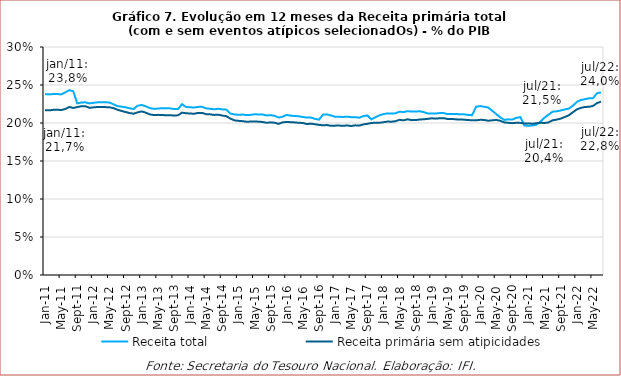
| Category | Receita total | Receita primária sem atipicidades |
|---|---|---|
| 2011-01-01 | 0.238 | 0.217 |
| 2011-02-01 | 0.238 | 0.217 |
| 2011-03-01 | 0.238 | 0.217 |
| 2011-04-01 | 0.238 | 0.218 |
| 2011-05-01 | 0.238 | 0.217 |
| 2011-06-01 | 0.24 | 0.218 |
| 2011-07-01 | 0.243 | 0.221 |
| 2011-08-01 | 0.242 | 0.22 |
| 2011-09-01 | 0.226 | 0.221 |
| 2011-10-01 | 0.227 | 0.222 |
| 2011-11-01 | 0.227 | 0.222 |
| 2011-12-01 | 0.226 | 0.22 |
| 2012-01-01 | 0.227 | 0.221 |
| 2012-02-01 | 0.227 | 0.221 |
| 2012-03-01 | 0.227 | 0.221 |
| 2012-04-01 | 0.227 | 0.221 |
| 2012-05-01 | 0.227 | 0.221 |
| 2012-06-01 | 0.225 | 0.22 |
| 2012-07-01 | 0.222 | 0.217 |
| 2012-08-01 | 0.222 | 0.216 |
| 2012-09-01 | 0.221 | 0.214 |
| 2012-10-01 | 0.219 | 0.213 |
| 2012-11-01 | 0.218 | 0.212 |
| 2012-12-01 | 0.223 | 0.214 |
| 2013-01-01 | 0.224 | 0.215 |
| 2013-02-01 | 0.222 | 0.214 |
| 2013-03-01 | 0.22 | 0.211 |
| 2013-04-01 | 0.219 | 0.21 |
| 2013-05-01 | 0.219 | 0.211 |
| 2013-06-01 | 0.219 | 0.211 |
| 2013-07-01 | 0.219 | 0.21 |
| 2013-08-01 | 0.219 | 0.21 |
| 2013-09-01 | 0.218 | 0.21 |
| 2013-10-01 | 0.218 | 0.21 |
| 2013-11-01 | 0.225 | 0.214 |
| 2013-12-01 | 0.221 | 0.213 |
| 2014-01-01 | 0.221 | 0.212 |
| 2014-02-01 | 0.22 | 0.212 |
| 2014-03-01 | 0.221 | 0.213 |
| 2014-04-01 | 0.221 | 0.213 |
| 2014-05-01 | 0.219 | 0.212 |
| 2014-06-01 | 0.219 | 0.211 |
| 2014-07-01 | 0.218 | 0.211 |
| 2014-08-01 | 0.219 | 0.211 |
| 2014-09-01 | 0.218 | 0.21 |
| 2014-10-01 | 0.218 | 0.209 |
| 2014-11-01 | 0.212 | 0.206 |
| 2014-12-01 | 0.211 | 0.204 |
| 2015-01-01 | 0.211 | 0.203 |
| 2015-02-01 | 0.211 | 0.202 |
| 2015-03-01 | 0.21 | 0.202 |
| 2015-04-01 | 0.211 | 0.202 |
| 2015-05-01 | 0.211 | 0.202 |
| 2015-06-01 | 0.211 | 0.202 |
| 2015-07-01 | 0.211 | 0.201 |
| 2015-08-01 | 0.21 | 0.2 |
| 2015-09-01 | 0.21 | 0.201 |
| 2015-10-01 | 0.209 | 0.2 |
| 2015-11-01 | 0.207 | 0.199 |
| 2015-12-01 | 0.208 | 0.201 |
| 2016-01-01 | 0.211 | 0.201 |
| 2016-02-01 | 0.21 | 0.201 |
| 2016-03-01 | 0.209 | 0.201 |
| 2016-04-01 | 0.209 | 0.2 |
| 2016-05-01 | 0.208 | 0.2 |
| 2016-06-01 | 0.207 | 0.199 |
| 2016-07-01 | 0.207 | 0.199 |
| 2016-08-01 | 0.205 | 0.198 |
| 2016-09-01 | 0.204 | 0.198 |
| 2016-10-01 | 0.211 | 0.197 |
| 2016-11-01 | 0.211 | 0.197 |
| 2016-12-01 | 0.21 | 0.196 |
| 2017-01-01 | 0.208 | 0.197 |
| 2017-02-01 | 0.208 | 0.197 |
| 2017-03-01 | 0.208 | 0.196 |
| 2017-04-01 | 0.208 | 0.197 |
| 2017-05-01 | 0.208 | 0.196 |
| 2017-06-01 | 0.208 | 0.197 |
| 2017-07-01 | 0.207 | 0.197 |
| 2017-08-01 | 0.209 | 0.198 |
| 2017-09-01 | 0.21 | 0.199 |
| 2017-10-01 | 0.205 | 0.2 |
| 2017-11-01 | 0.208 | 0.2 |
| 2017-12-01 | 0.21 | 0.2 |
| 2018-01-01 | 0.212 | 0.201 |
| 2018-02-01 | 0.213 | 0.202 |
| 2018-03-01 | 0.212 | 0.202 |
| 2018-04-01 | 0.213 | 0.202 |
| 2018-05-01 | 0.215 | 0.204 |
| 2018-06-01 | 0.214 | 0.204 |
| 2018-07-01 | 0.216 | 0.205 |
| 2018-08-01 | 0.215 | 0.204 |
| 2018-09-01 | 0.215 | 0.204 |
| 2018-10-01 | 0.215 | 0.205 |
| 2018-11-01 | 0.214 | 0.205 |
| 2018-12-01 | 0.213 | 0.205 |
| 2019-01-01 | 0.212 | 0.206 |
| 2019-02-01 | 0.213 | 0.206 |
| 2019-03-01 | 0.213 | 0.206 |
| 2019-04-01 | 0.213 | 0.206 |
| 2019-05-01 | 0.212 | 0.205 |
| 2019-06-01 | 0.212 | 0.205 |
| 2019-07-01 | 0.212 | 0.205 |
| 2019-08-01 | 0.211 | 0.205 |
| 2019-09-01 | 0.211 | 0.204 |
| 2019-10-01 | 0.211 | 0.204 |
| 2019-11-01 | 0.21 | 0.204 |
| 2019-12-01 | 0.221 | 0.204 |
| 2020-01-01 | 0.222 | 0.204 |
| 2020-02-01 | 0.221 | 0.204 |
| 2020-03-01 | 0.22 | 0.203 |
| 2020-04-01 | 0.216 | 0.204 |
| 2020-05-01 | 0.212 | 0.204 |
| 2020-06-01 | 0.207 | 0.203 |
| 2020-07-01 | 0.204 | 0.201 |
| 2020-08-01 | 0.205 | 0.2 |
| 2020-09-01 | 0.205 | 0.2 |
| 2020-10-01 | 0.207 | 0.2 |
| 2020-11-01 | 0.208 | 0.2 |
| 2020-12-01 | 0.197 | 0.199 |
| 2021-01-01 | 0.196 | 0.2 |
| 2021-02-01 | 0.197 | 0.199 |
| 2021-03-01 | 0.198 | 0.2 |
| 2021-04-01 | 0.202 | 0.2 |
| 2021-05-01 | 0.207 | 0.2 |
| 2021-06-01 | 0.211 | 0.201 |
| 2021-07-01 | 0.215 | 0.204 |
| 2021-08-01 | 0.215 | 0.204 |
| 2021-09-01 | 0.216 | 0.206 |
| 2021-10-01 | 0.218 | 0.208 |
| 2021-11-01 | 0.219 | 0.21 |
| 2021-12-01 | 0.223 | 0.214 |
| 2022-01-01 | 0.228 | 0.218 |
| 2022-02-01 | 0.23 | 0.22 |
| 2022-03-01 | 0.231 | 0.221 |
| 2022-04-01 | 0.233 | 0.221 |
| 2022-05-01 | 0.232 | 0.222 |
| 2022-06-01 | 0.239 | 0.226 |
| 2022-07-01 | 0.24 | 0.228 |